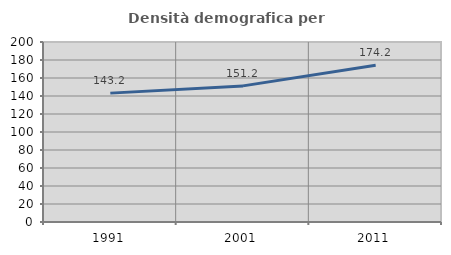
| Category | Densità demografica |
|---|---|
| 1991.0 | 143.195 |
| 2001.0 | 151.238 |
| 2011.0 | 174.164 |